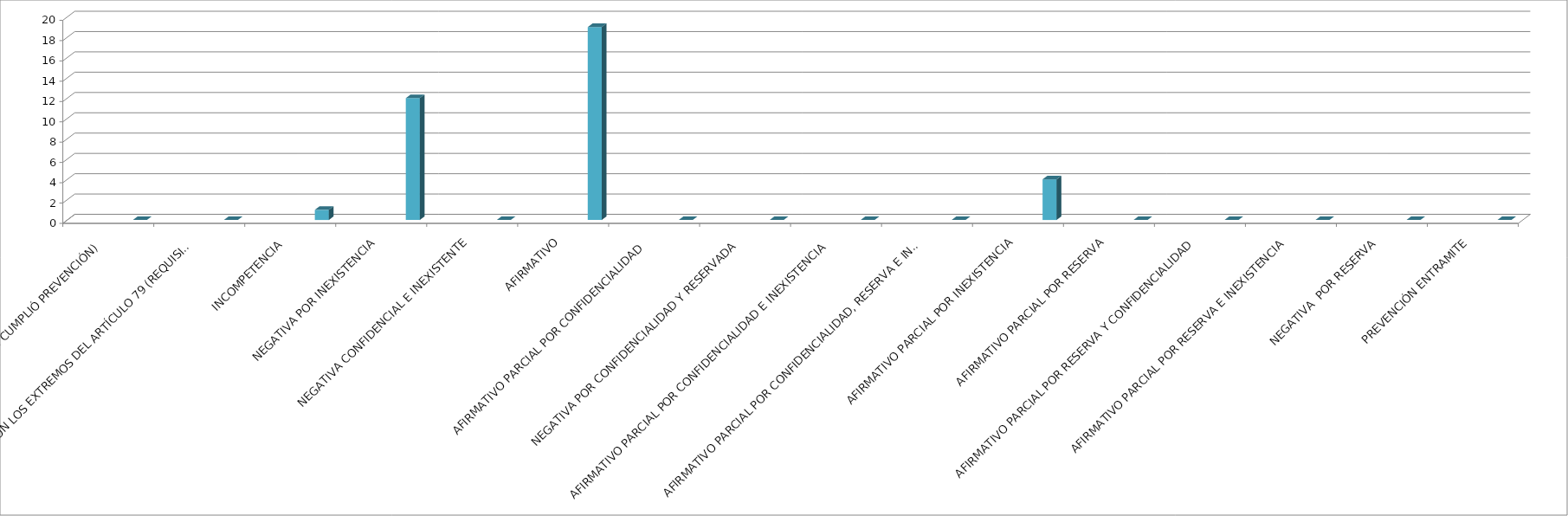
| Category | Series 0 | Series 1 | Series 2 | Series 3 | Series 4 |
|---|---|---|---|---|---|
| SE TIENE POR NO PRESENTADA ( NO CUMPLIÓ PREVENCIÓN) |  |  |  |  | 0 |
| NO CUMPLIO CON LOS EXTREMOS DEL ARTÍCULO 79 (REQUISITOS) |  |  |  |  | 0 |
| INCOMPETENCIA  |  |  |  |  | 1 |
| NEGATIVA POR INEXISTENCIA |  |  |  |  | 12 |
| NEGATIVA CONFIDENCIAL E INEXISTENTE |  |  |  |  | 0 |
| AFIRMATIVO |  |  |  |  | 19 |
| AFIRMATIVO PARCIAL POR CONFIDENCIALIDAD  |  |  |  |  | 0 |
| NEGATIVA POR CONFIDENCIALIDAD Y RESERVADA |  |  |  |  | 0 |
| AFIRMATIVO PARCIAL POR CONFIDENCIALIDAD E INEXISTENCIA |  |  |  |  | 0 |
| AFIRMATIVO PARCIAL POR CONFIDENCIALIDAD, RESERVA E INEXISTENCIA |  |  |  |  | 0 |
| AFIRMATIVO PARCIAL POR INEXISTENCIA |  |  |  |  | 4 |
| AFIRMATIVO PARCIAL POR RESERVA |  |  |  |  | 0 |
| AFIRMATIVO PARCIAL POR RESERVA Y CONFIDENCIALIDAD |  |  |  |  | 0 |
| AFIRMATIVO PARCIAL POR RESERVA E INEXISTENCIA |  |  |  |  | 0 |
| NEGATIVA  POR RESERVA |  |  |  |  | 0 |
| PREVENCIÓN ENTRAMITE |  |  |  |  | 0 |